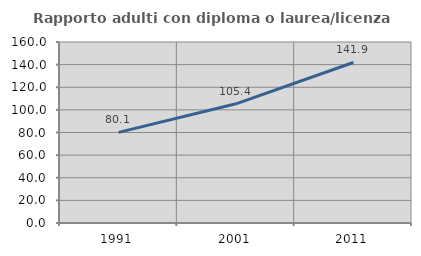
| Category | Rapporto adulti con diploma o laurea/licenza media  |
|---|---|
| 1991.0 | 80.082 |
| 2001.0 | 105.378 |
| 2011.0 | 141.891 |